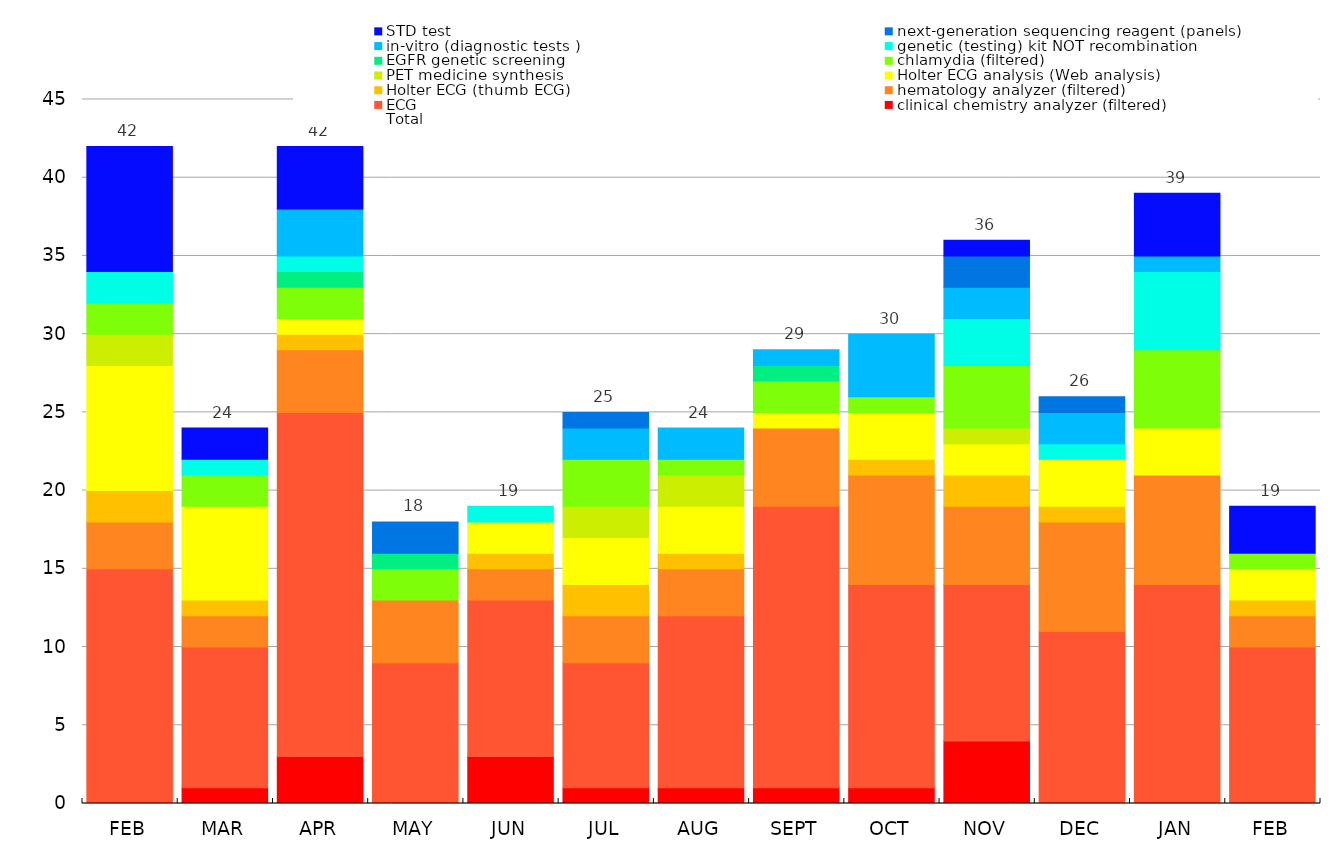
| Category | clinical chemistry analyzer (filtered) | ECG | hematology analyzer (filtered) | Holter ECG (thumb ECG) | Holter ECG analysis (Web analysis) | PET medicine synthesis | chlamydia (filtered) | EGFR genetic screening | genetic (testing) kit NOT recombination | in-vitro (diagnostic tests ) | next-generation sequencing reagent (panels) | STD test |
|---|---|---|---|---|---|---|---|---|---|---|---|---|
| FEB | 0 | 15 | 3 | 2 | 8 | 2 | 2 | 0 | 2 | 0 | 0 | 8 |
| MAR | 1 | 9 | 2 | 1 | 6 | 0 | 2 | 0 | 1 | 0 | 0 | 2 |
| APR | 3 | 22 | 4 | 1 | 1 | 0 | 2 | 1 | 1 | 3 | 0 | 4 |
| MAY | 0 | 9 | 4 | 0 | 0 | 0 | 2 | 1 | 0 | 0 | 2 | 0 |
| JUN | 3 | 10 | 2 | 1 | 2 | 0 | 0 | 0 | 1 | 0 | 0 | 0 |
| JUL | 1 | 8 | 3 | 2 | 3 | 2 | 3 | 0 | 0 | 2 | 1 | 0 |
| AUG | 1 | 11 | 3 | 1 | 3 | 2 | 1 | 0 | 0 | 2 | 0 | 0 |
| SEPT | 1 | 18 | 5 | 0 | 1 | 0 | 2 | 1 | 0 | 1 | 0 | 0 |
| OCT | 1 | 13 | 7 | 1 | 3 | 0 | 1 | 0 | 0 | 4 | 0 | 0 |
| NOV | 4 | 10 | 5 | 2 | 2 | 1 | 4 | 0 | 3 | 2 | 2 | 1 |
| DEC | 0 | 11 | 7 | 1 | 3 | 0 | 0 | 0 | 1 | 2 | 1 | 0 |
| JAN | 0 | 14 | 7 | 0 | 3 | 0 | 5 | 0 | 5 | 1 | 0 | 4 |
| FEB | 0 | 10 | 2 | 1 | 2 | 0 | 1 | 0 | 0 | 0 | 0 | 3 |